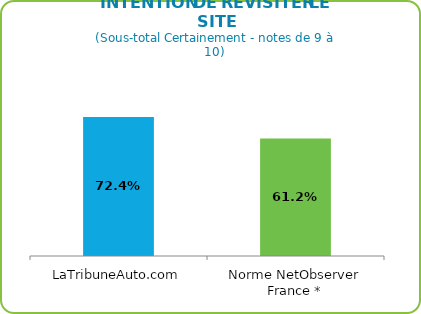
| Category | Sous-total Certainement (notes de 9 à 10) |
|---|---|
| LaTribuneAuto.com | 0.724 |
| Norme NetObserver France * | 0.612 |